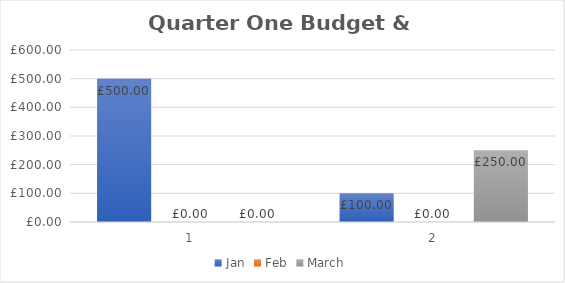
| Category | Jan | Feb | March |
|---|---|---|---|
| 0 | 500 | 0 | 0 |
| 1 | 100 | 0 | 250 |